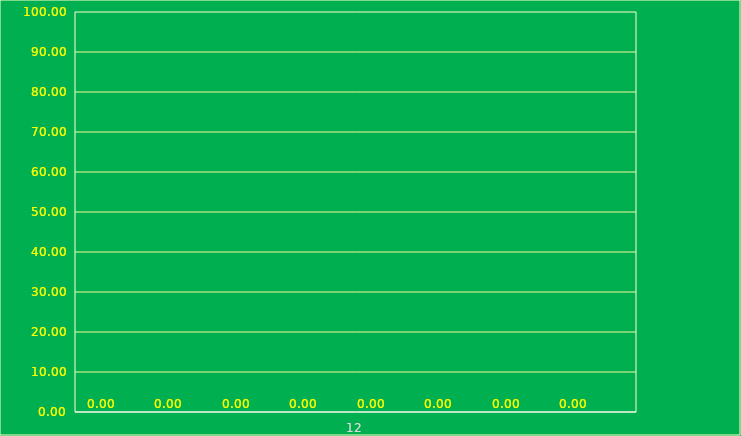
| Category | AGE 5 | AGE 6 | AGE 7 | AGE 8 | AGE 9 | AGE 10 | AGE 11 | AGE 12 |
|---|---|---|---|---|---|---|---|---|
| 0 |  |  |  |  |  |  |  |  |